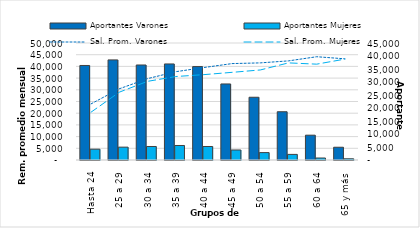
| Category | Aportantes Varones | Aportantes Mujeres |
|---|---|---|
| Hasta 24 | 36355 | 4159 |
| 25 a 29 | 38500 | 4940 |
| 30 a 34 | 36543 | 5193 |
| 35 a 39 | 36946 | 5582 |
| 40 a 44 | 35928 | 5193 |
| 45 a 49 | 29245 | 3858 |
| 50 a 54 | 24129 | 2846 |
| 55 a 59 | 18558 | 2155 |
| 60 a 64 | 9548 | 769 |
| 65 y más | 4909 | 467 |